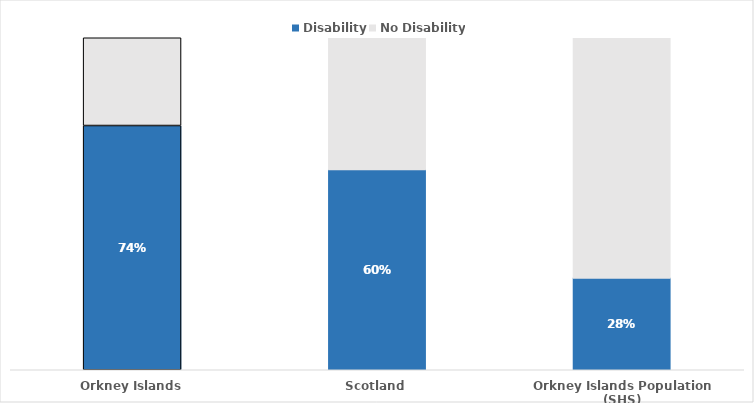
| Category | Disability | No Disability |
|---|---|---|
| Orkney Islands | 0.736 | 0.264 |
| Scotland | 0.605 | 0.395 |
| Orkney Islands Population (SHS) | 0.278 | 0.722 |